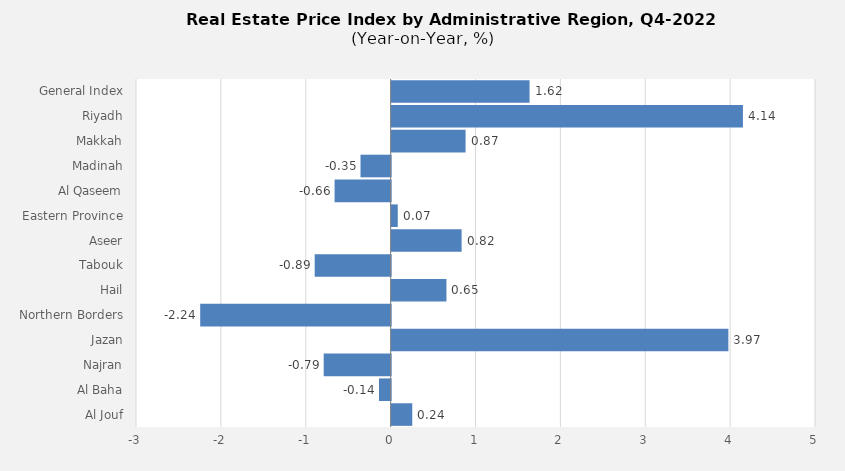
| Category | 2022 |
|---|---|
| General Index | 1.625 |
| Riyadh | 4.139 |
| Makkah | 0.871 |
| Madinah | -0.355 |
| Al Qaseem | -0.66 |
| Eastern Province | 0.072 |
| Aseer | 0.825 |
| Tabouk | -0.895 |
| Hail | 0.646 |
| Northern Borders | -2.244 |
| Jazan | 3.968 |
| Najran | -0.789 |
| Al Baha | -0.137 |
| Al Jouf | 0.243 |